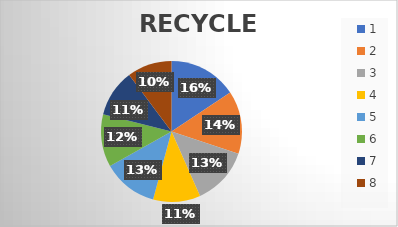
| Category | RECYCLE PLAY | ZOE |
|---|---|---|
| 0 | 26 | 30 |
| 1 | 24 | 26 |
| 2 | 22 | 22 |
| 3 | 18 | 19 |
| 4 | 21 | 33 |
| 5 | 20 | 28 |
| 6 | 18 | 19 |
| 7 | 17 | 31 |